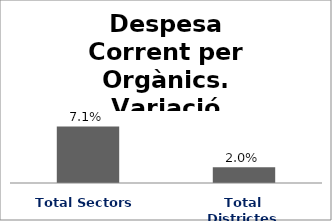
| Category | Series 0 |
|---|---|
| Total Sectors | 0.071 |
| Total Districtes | 0.02 |